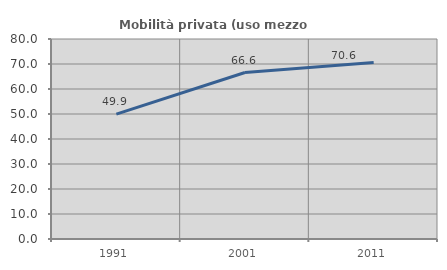
| Category | Mobilità privata (uso mezzo privato) |
|---|---|
| 1991.0 | 49.948 |
| 2001.0 | 66.581 |
| 2011.0 | 70.631 |